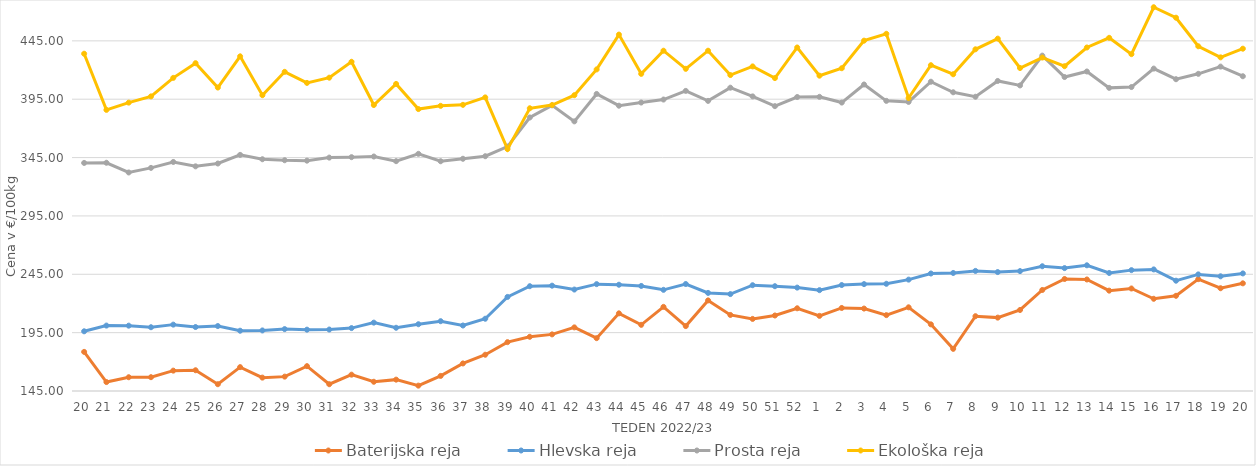
| Category | Baterijska reja | Hlevska reja | Prosta reja | Ekološka reja |
|---|---|---|---|---|
| 20.0 | 178.51 | 196.16 | 340.4 | 433.97 |
| 21.0 | 152.67 | 201.05 | 340.55 | 385.86 |
| 22.0 | 156.8 | 200.98 | 332.23 | 392.07 |
| 23.0 | 156.84 | 199.63 | 336.16 | 397.41 |
| 24.0 | 162.44 | 201.86 | 341.24 | 413.28 |
| 25.0 | 162.78 | 199.81 | 337.48 | 425.86 |
| 26.0 | 150.82 | 200.65 | 339.9 | 405 |
| 27.0 | 165.45 | 196.64 | 347.3 | 431.72 |
| 28.0 | 156.46 | 196.88 | 343.56 | 398.45 |
| 29.0 | 157.31 | 198.03 | 342.71 | 418.45 |
| 30.0 | 166.29 | 197.55 | 342.35 | 408.97 |
| 31.0 | 150.81 | 197.66 | 344.97 | 413.45 |
| 32.0 | 158.99 | 198.9 | 345.35 | 427.07 |
| 33.0 | 152.91 | 203.57 | 345.9 | 390 |
| 34.0 | 154.73 | 199.17 | 341.92 | 408.1 |
| 35.0 | 149.6 | 202.21 | 348.2 | 386.55 |
| 36.0 | 157.93 | 204.81 | 341.85 | 389.31 |
| 37.0 | 168.61 | 201.11 | 343.97 | 390.17 |
| 38.0 | 176.07 | 206.91 | 346.16 | 396.55 |
| 39.0 | 186.86 | 225.6 | 354.41 | 352.24 |
| 40.0 | 191.45 | 234.79 | 379.35 | 387.24 |
| 41.0 | 193.52 | 235.24 | 389.75 | 390 |
| 42.0 | 199.51 | 231.92 | 376.02 | 398.45 |
| 43.0 | 190.28 | 236.56 | 399.51 | 420.52 |
| 44.0 | 211.53 | 236.04 | 389.44 | 450.35 |
| 45.0 | 201.69 | 235.01 | 392.15 | 416.72 |
| 46.0 | 217.08 | 231.68 | 394.71 | 436.55 |
| 47.0 | 200.62 | 236.65 | 402.12 | 421.03 |
| 48.0 | 222.61 | 229.05 | 393.56 | 436.55 |
| 49.0 | 210.16 | 228.03 | 404.87 | 415.69 |
| 50.0 | 206.76 | 235.63 | 397.4 | 423.1 |
| 51.0 | 209.69 | 234.79 | 389.05 | 413.1 |
| 52.0 | 215.87 | 233.58 | 396.87 | 439.31 |
| 1.0 | 209.37 | 231.41 | 397.04 | 415.17 |
| 2.0 | 216.15 | 235.78 | 392.13 | 421.55 |
| 3.0 | 215.63 | 236.58 | 407.61 | 445.17 |
| 4.0 | 210 | 236.85 | 393.58 | 451.04 |
| 5.0 | 216.7 | 240.42 | 392.67 | 396.03 |
| 6.0 | 202.1 | 245.67 | 409.97 | 424.14 |
| 7.0 | 181.11 | 246.12 | 400.94 | 416.38 |
| 8.0 | 209.08 | 247.88 | 397.11 | 437.76 |
| 9.0 | 207.87 | 246.89 | 410.64 | 446.9 |
| 10.0 | 214.42 | 247.73 | 406.8 | 421.72 |
| 11.0 | 231.56 | 251.88 | 432.34 | 430.69 |
| 12.0 | 240.97 | 250.3 | 414 | 423.28 |
| 13.0 | 240.55 | 252.7 | 418.74 | 439.31 |
| 14.0 | 230.99 | 246.12 | 404.72 | 447.59 |
| 15.0 | 232.82 | 248.56 | 405.42 | 433.62 |
| 16.0 | 224 | 249.17 | 421.22 | 473.79 |
| 17.0 | 226.57 | 239.5 | 412.13 | 464.83 |
| 18.0 | 240.83 | 244.89 | 416.74 | 440.35 |
| 19.0 | 233.05 | 243.26 | 422.93 | 430.86 |
| 20.0 | 237.25 | 245.73 | 414.68 | 438.28 |